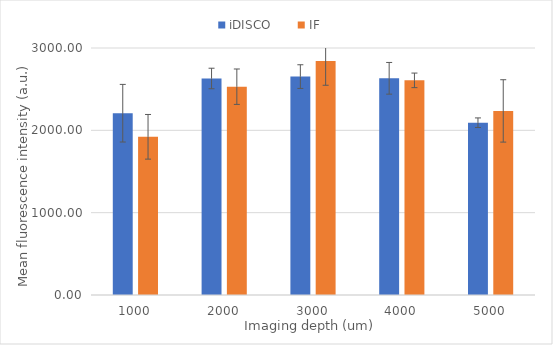
| Category | iDISCO | IF |
|---|---|---|
| 1000.0 | 2207.93 | 1921.337 |
| 2000.0 | 2629.677 | 2530.043 |
| 3000.0 | 2652.787 | 2842.067 |
| 4000.0 | 2631.857 | 2607.06 |
| 5000.0 | 2092.773 | 2235.87 |